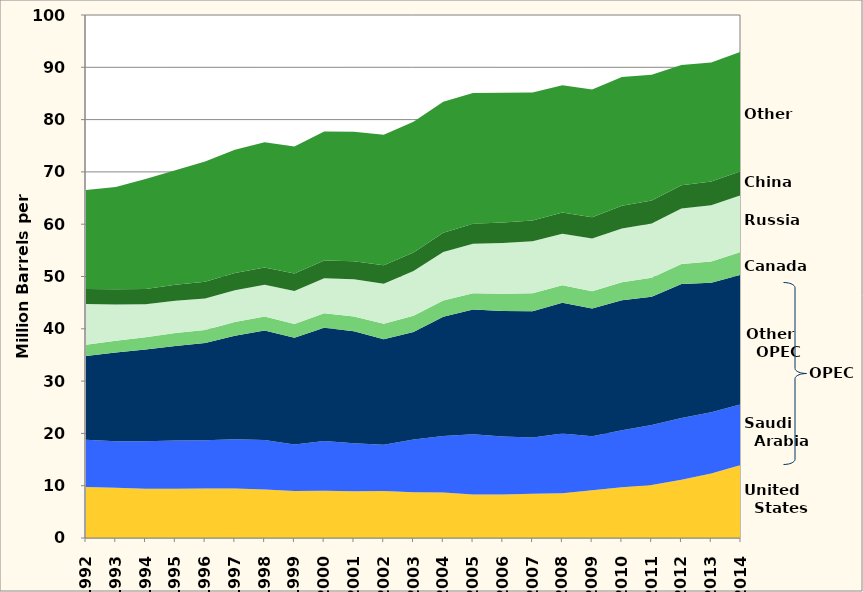
| Category | United States | Saudi Arabia | Other OPEC | Canada | Russia | China | Other |
|---|---|---|---|---|---|---|---|
| 1992.0 | 9.768 | 9.036 | 16.003 | 2.126 | 7.819 | 2.852 | 18.949 |
| 1993.0 | 9.602 | 8.894 | 16.954 | 2.25 | 6.951 | 2.903 | 19.547 |
| 1994.0 | 9.413 | 9.101 | 17.514 | 2.341 | 6.307 | 2.957 | 21.003 |
| 1995.0 | 9.4 | 9.235 | 18.098 | 2.453 | 6.172 | 3.06 | 21.886 |
| 1996.0 | 9.445 | 9.238 | 18.609 | 2.501 | 6.017 | 3.211 | 22.966 |
| 1997.0 | 9.461 | 9.4 | 19.806 | 2.627 | 6.101 | 3.285 | 23.541 |
| 1998.0 | 9.278 | 9.472 | 20.904 | 2.7 | 6.07 | 3.302 | 23.955 |
| 1999.0 | 8.993 | 8.907 | 20.405 | 2.633 | 6.312 | 3.317 | 24.271 |
| 2000.0 | 9.058 | 9.476 | 21.674 | 2.753 | 6.724 | 3.378 | 24.663 |
| 2001.0 | 8.957 | 9.157 | 21.406 | 2.816 | 7.16 | 3.435 | 24.742 |
| 2002.0 | 8.998 | 8.81 | 20.188 | 2.954 | 7.659 | 3.535 | 24.957 |
| 2003.0 | 8.766 | 10.077 | 20.541 | 3.114 | 8.535 | 3.573 | 25.001 |
| 2004.0 | 8.722 | 10.796 | 22.766 | 3.139 | 9.274 | 3.675 | 25.03 |
| 2005.0 | 8.325 | 11.496 | 23.856 | 3.096 | 9.511 | 3.809 | 25.007 |
| 2006.0 | 8.316 | 11.098 | 23.985 | 3.292 | 9.732 | 3.884 | 24.845 |
| 2007.0 | 8.469 | 10.749 | 24.143 | 3.449 | 9.938 | 3.958 | 24.461 |
| 2008.0 | 8.564 | 11.429 | 24.981 | 3.348 | 9.875 | 4.039 | 24.334 |
| 2009.0 | 9.13 | 10.315 | 24.436 | 3.319 | 10.05 | 4.075 | 24.415 |
| 2010.0 | 9.696 | 10.908 | 24.832 | 3.442 | 10.294 | 4.373 | 24.615 |
| 2011.0 | 10.128 | 11.467 | 24.549 | 3.597 | 10.41 | 4.37 | 24.062 |
| 2012.0 | 11.119 | 11.841 | 25.595 | 3.856 | 10.595 | 4.459 | 22.997 |
| 2013.0 | 12.343 | 11.702 | 24.746 | 4.073 | 10.764 | 4.543 | 22.734 |
| 2014.0 | 13.973 | 11.624 | 24.719 | 4.383 | 10.853 | 4.572 | 22.895 |